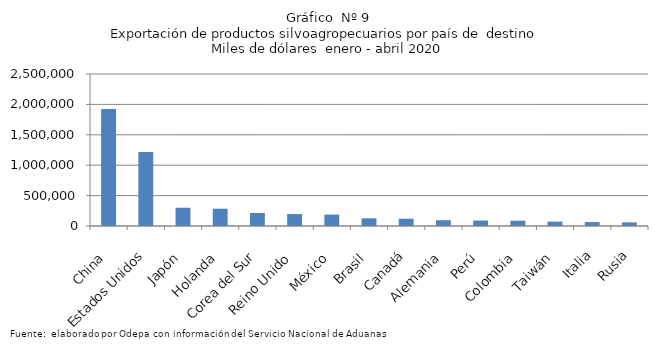
| Category | Series 0 |
|---|---|
| China | 1924221.406 |
| Estados Unidos | 1216251.909 |
| Japón | 300392.997 |
| Holanda | 284059.582 |
| Corea del Sur | 214024.918 |
| Reino Unido | 196285.391 |
| México | 187745.175 |
| Brasil | 126494.08 |
| Canadá | 119718.141 |
| Alemania | 95098.619 |
| Perú | 89917.311 |
| Colombia | 87317.718 |
| Taiwán | 71890.779 |
| Italia | 64619.857 |
| Rusia | 59861.296 |